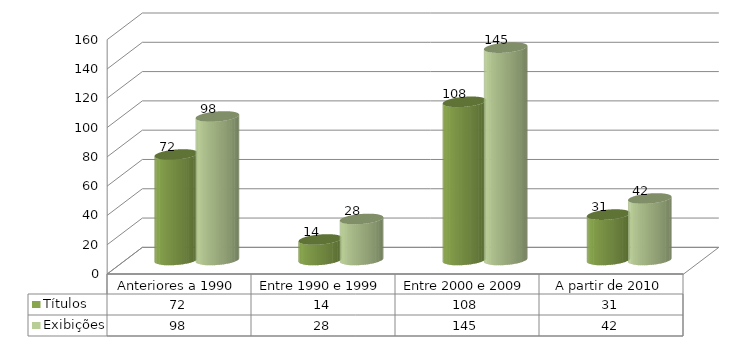
| Category | Títulos | Exibições |
|---|---|---|
| Anteriores a 1990 | 72 | 98 |
| Entre 1990 e 1999 | 14 | 28 |
| Entre 2000 e 2009 | 108 | 145 |
| A partir de 2010 | 31 | 42 |